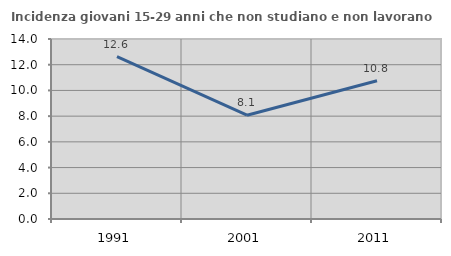
| Category | Incidenza giovani 15-29 anni che non studiano e non lavorano  |
|---|---|
| 1991.0 | 12.635 |
| 2001.0 | 8.073 |
| 2011.0 | 10.757 |